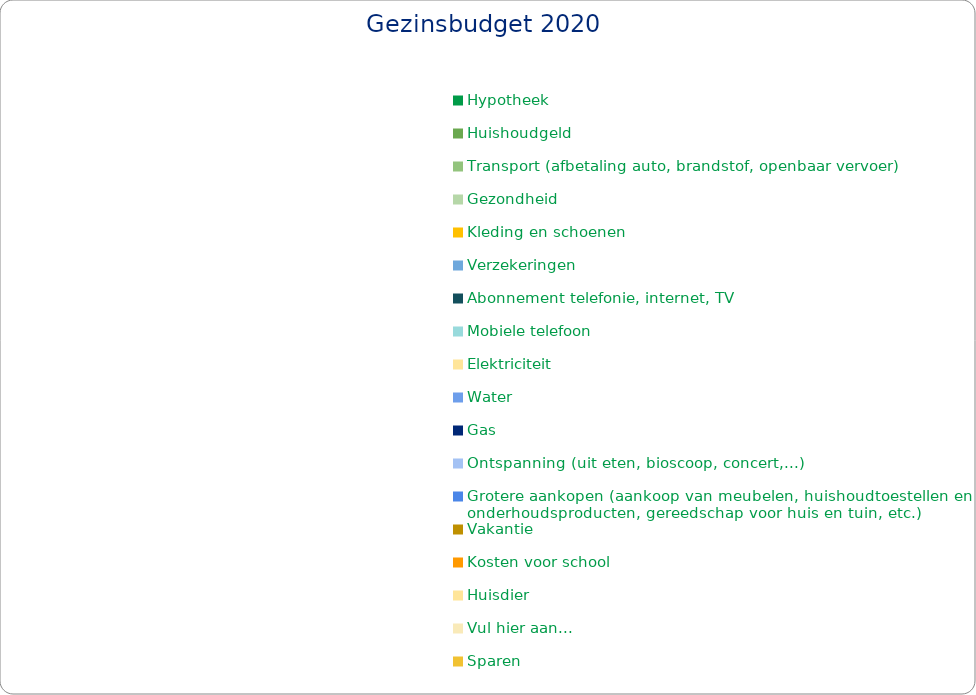
| Category | Series 0 |
|---|---|
| Hypotheek | 0 |
| Huishoudgeld  | 0 |
| Transport (afbetaling auto, brandstof, openbaar vervoer)  | 0 |
| Gezondheid | 0 |
| Kleding en schoenen | 0 |
| Verzekeringen | 0 |
| Abonnement telefonie, internet, TV | 0 |
| Mobiele telefoon | 0 |
| Elektriciteit | 0 |
| Water | 0 |
| Gas | 0 |
| Ontspanning (uit eten, bioscoop, concert,...) | 0 |
| Grotere aankopen (aankoop van meubelen, huishoudtoestellen en onderhoudsproducten, gereedschap voor huis en tuin, etc.) | 0 |
| Vakantie | 0 |
| Kosten voor school  | 0 |
| Huisdier | 0 |
| Vul hier aan...  | 0 |
| Sparen | 0 |